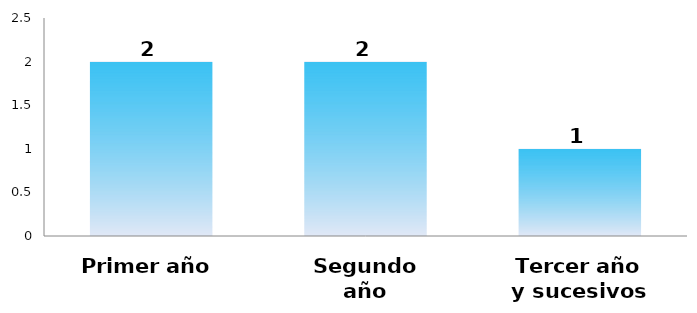
| Category | Series 0 |
|---|---|
| Primer año | 2 |
| Segundo año | 2 |
| Tercer año y sucesivos | 1 |